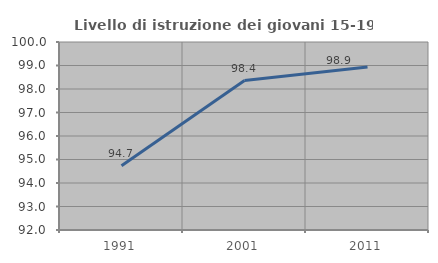
| Category | Livello di istruzione dei giovani 15-19 anni |
|---|---|
| 1991.0 | 94.737 |
| 2001.0 | 98.361 |
| 2011.0 | 98.936 |